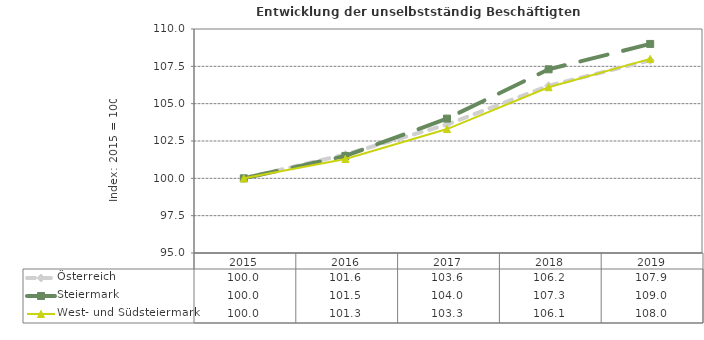
| Category | Österreich | Steiermark | West- und Südsteiermark |
|---|---|---|---|
| 2019.0 | 107.9 | 109 | 108 |
| 2018.0 | 106.2 | 107.3 | 106.1 |
| 2017.0 | 103.6 | 104 | 103.3 |
| 2016.0 | 101.6 | 101.5 | 101.3 |
| 2015.0 | 100 | 100 | 100 |